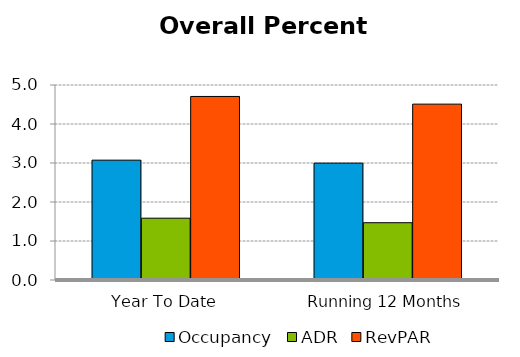
| Category | Occupancy | ADR | RevPAR |
|---|---|---|---|
| Year To Date | 3.073 | 1.585 | 4.706 |
| Running 12 Months | 2.996 | 1.469 | 4.509 |